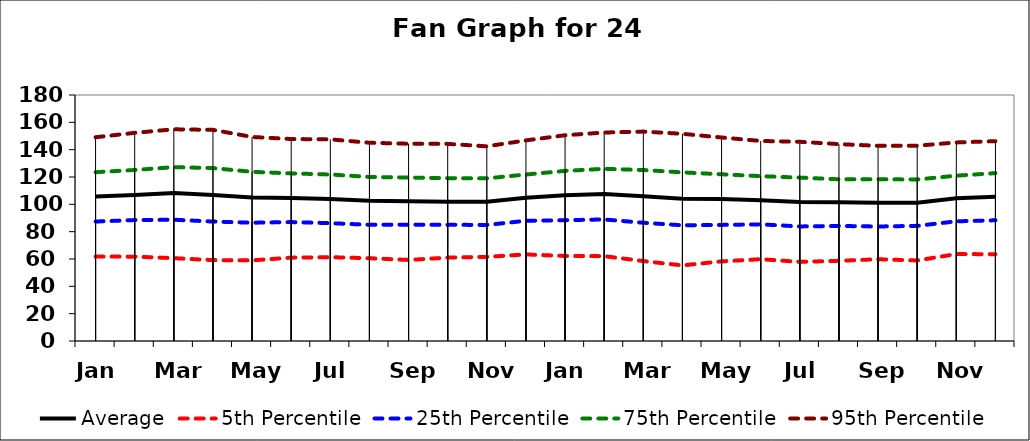
| Category | Average | 5th Percentile | 25th Percentile | 75th Percentile | 95th Percentile |
|---|---|---|---|---|---|
|  Jan | 105.702 | 61.743 | 87.418 | 123.502 | 149.088 |
|  Feb | 106.889 | 61.734 | 88.497 | 125.137 | 152.303 |
|  Mar | 108.23 | 60.616 | 88.739 | 127.219 | 154.901 |
|  Apr | 106.765 | 59.187 | 87.399 | 126.523 | 154.497 |
|  May | 104.968 | 58.993 | 86.547 | 123.791 | 149.298 |
|  Jun | 104.553 | 60.986 | 87.018 | 122.625 | 147.798 |
|  Jul | 103.95 | 61.341 | 86.224 | 121.836 | 147.541 |
|  Aug | 102.563 | 60.56 | 85.039 | 120.046 | 145.063 |
|  Sep | 102.175 | 59.313 | 85.121 | 119.601 | 144.346 |
|  Oct | 101.854 | 61.006 | 85.001 | 119.165 | 144.237 |
|  Nov | 101.948 | 61.57 | 84.936 | 118.989 | 142.446 |
|  Dec | 104.893 | 63.344 | 87.953 | 121.82 | 146.788 |
|  Jan | 106.652 | 62.23 | 88.395 | 124.456 | 150.548 |
|  Feb | 107.477 | 62.081 | 88.94 | 125.994 | 152.544 |
|  Mar | 105.919 | 58.484 | 86.525 | 125.107 | 153.232 |
|  Apr | 104.005 | 55.332 | 84.653 | 123.385 | 151.603 |
|  May | 103.838 | 58.256 | 84.955 | 121.993 | 148.906 |
|  Jun | 102.903 | 59.859 | 85.342 | 120.63 | 146.382 |
|  Jul | 101.681 | 57.897 | 83.835 | 119.553 | 145.764 |
|  Aug | 101.478 | 58.659 | 84.188 | 118.331 | 144.067 |
|  Sep | 101.077 | 59.839 | 83.788 | 118.379 | 142.811 |
|  Oct | 101.185 | 58.922 | 84.257 | 118.179 | 142.889 |
|  Nov | 104.374 | 63.61 | 87.559 | 120.965 | 145.291 |
|  Dec | 105.542 | 63.524 | 88.328 | 122.82 | 146.215 |